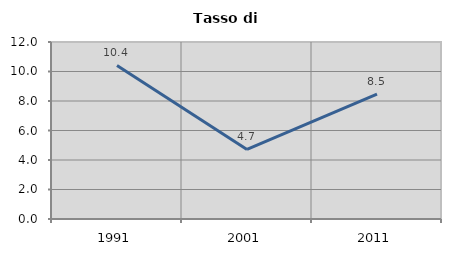
| Category | Tasso di disoccupazione   |
|---|---|
| 1991.0 | 10.409 |
| 2001.0 | 4.714 |
| 2011.0 | 8.464 |